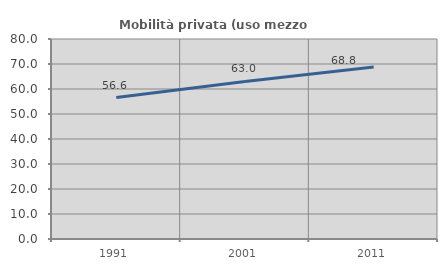
| Category | Mobilità privata (uso mezzo privato) |
|---|---|
| 1991.0 | 56.556 |
| 2001.0 | 63.043 |
| 2011.0 | 68.794 |